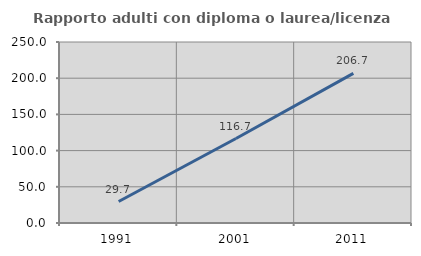
| Category | Rapporto adulti con diploma o laurea/licenza media  |
|---|---|
| 1991.0 | 29.67 |
| 2001.0 | 116.667 |
| 2011.0 | 206.667 |